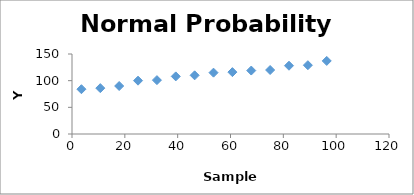
| Category | Series 0 |
|---|---|
| 3.5714285714285716 | 84 |
| 10.714285714285715 | 86 |
| 17.857142857142858 | 90 |
| 25.000000000000004 | 100 |
| 32.142857142857146 | 101 |
| 39.285714285714285 | 108 |
| 46.42857142857143 | 110 |
| 53.57142857142857 | 115 |
| 60.714285714285715 | 116 |
| 67.85714285714286 | 119 |
| 75.0 | 120 |
| 82.14285714285714 | 128 |
| 89.28571428571429 | 129 |
| 96.42857142857143 | 137 |